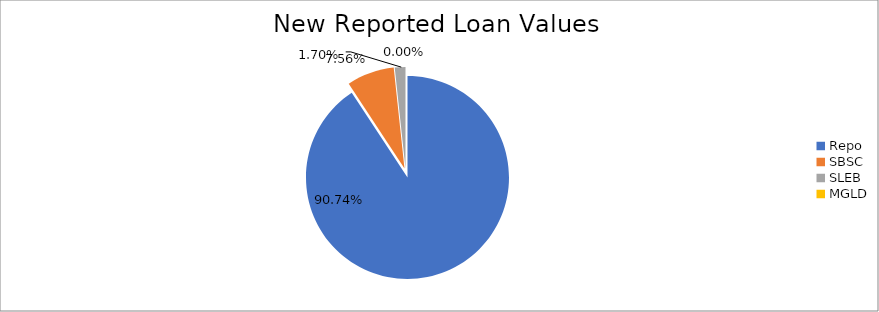
| Category | Series 0 |
|---|---|
| Repo | 10455483.43 |
| SBSC | 871141.652 |
| SLEB | 195526.652 |
| MGLD | 10.426 |